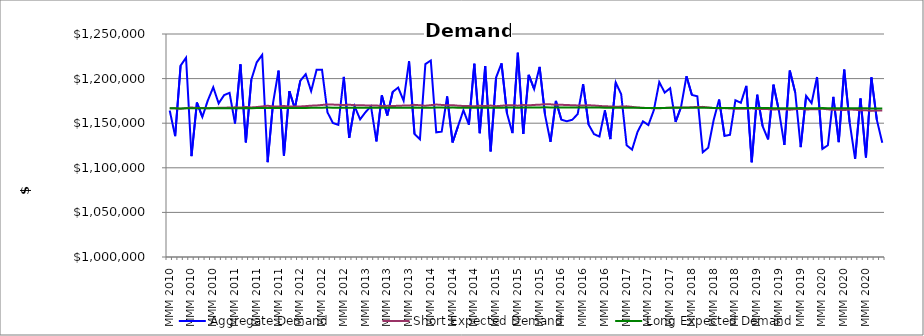
| Category | Aggregate Demand | Short Expected Demand | Long Expected Demand |
|---|---|---|---|
| MMM 2010 | 1164194.609 | 1166666.667 | 1166666.667 |
| MMM 2010 | 1135446.63 | 1166632.333 | 1166660.944 |
| MMM 2010 | 1214554.792 | 1166199.198 | 1166588.689 |
| MMM 2010 | 1223487.7 | 1166870.803 | 1166699.722 |
| MMM 2010 | 1113027.464 | 1167657.149 | 1166831.175 |
| MMM 2010 | 1173169.314 | 1166898.403 | 1166706.63 |
| MMM 2010 | 1157034.892 | 1166985.499 | 1166721.59 |
| MMM 2010 | 1175444.263 | 1166847.297 | 1166699.167 |
| MMM 2010 | 1190233.897 | 1166966.699 | 1166719.41 |
| MMM 2010 | 1172214.79 | 1167289.854 | 1166773.842 |
| MMM 2010 | 1181515.811 | 1167358.256 | 1166786.436 |
| MMM 2010 | 1184015.983 | 1167554.889 | 1166820.532 |
| MMM 2011 | 1149696.797 | 1167783.515 | 1166860.336 |
| MMM 2011 | 1215984.754 | 1167532.311 | 1166820.606 |
| MMM 2011 | 1128503.597 | 1168205.261 | 1166934.412 |
| MMM 2011 | 1198880.14 | 1167653.849 | 1166845.452 |
| MMM 2011 | 1218255.849 | 1168087.548 | 1166919.606 |
| MMM 2011 | 1226548.237 | 1168784.33 | 1167038.44 |
| MMM 2011 | 1106292.168 | 1169586.606 | 1167176.194 |
| MMM 2011 | 1172752.238 | 1168707.517 | 1167035.259 |
| MMM 2011 | 1208910.718 | 1168763.694 | 1167048.493 |
| MMM 2011 | 1113692.409 | 1169321.291 | 1167145.396 |
| MMM 2011 | 1185913.686 | 1168548.668 | 1167021.662 |
| MMM 2011 | 1166619.405 | 1168789.849 | 1167065.394 |
| MMM 2012 | 1197530.766 | 1168759.704 | 1167064.361 |
| MMM 2012 | 1204944.936 | 1169159.302 | 1167134.885 |
| MMM 2012 | 1185958.102 | 1169656.324 | 1167222.409 |
| MMM 2012 | 1209828.676 | 1169882.738 | 1167265.778 |
| MMM 2012 | 1209876.225 | 1170437.543 | 1167364.304 |
| MMM 2012 | 1162174.485 | 1170985.302 | 1167462.711 |
| MMM 2012 | 1150232.175 | 1170862.93 | 1167450.47 |
| MMM 2012 | 1148167.163 | 1170576.391 | 1167410.612 |
| MMM 2012 | 1201850.005 | 1170265.152 | 1167366.067 |
| MMM 2012 | 1133459.538 | 1170703.831 | 1167445.891 |
| MMM 2012 | 1168894.621 | 1170186.549 | 1167367.219 |
| MMM 2012 | 1154326.3 | 1170168.605 | 1167370.755 |
| MMM 2013 | 1162403.599 | 1169948.573 | 1167340.559 |
| MMM 2013 | 1168925.276 | 1169843.782 | 1167329.131 |
| MMM 2013 | 1129578.788 | 1169831.025 | 1167332.826 |
| MMM 2013 | 1181213.447 | 1169271.966 | 1167245.432 |
| MMM 2013 | 1158613.517 | 1169437.82 | 1167277.766 |
| MMM 2013 | 1185109.805 | 1169287.483 | 1167257.71 |
| MMM 2013 | 1189923.099 | 1169507.237 | 1167299.034 |
| MMM 2013 | 1175242.226 | 1169790.791 | 1167351.404 |
| MMM 2013 | 1219461.653 | 1169866.505 | 1167369.67 |
| MMM 2013 | 1137936.966 | 1170555.327 | 1167490.253 |
| MMM 2013 | 1132058.161 | 1170102.294 | 1167421.843 |
| MMM 2013 | 1216194.025 | 1169573.903 | 1167339.983 |
| MMM 2014 | 1220249.879 | 1170221.405 | 1167453.071 |
| MMM 2014 | 1139788.092 | 1170916.245 | 1167575.286 |
| MMM 2014 | 1140476.061 | 1170483.909 | 1167510.963 |
| MMM 2014 | 1179952.491 | 1170067.134 | 1167448.383 |
| MMM 2014 | 1128409.199 | 1170204.43 | 1167477.327 |
| MMM 2014 | 1146570.339 | 1169623.941 | 1167386.892 |
| MMM 2014 | 1164436.876 | 1169303.752 | 1167338.705 |
| MMM 2014 | 1148371.452 | 1169236.156 | 1167331.988 |
| MMM 2014 | 1216640.89 | 1168946.369 | 1167288.098 |
| MMM 2014 | 1138784.863 | 1169608.793 | 1167402.341 |
| MMM 2014 | 1213930.409 | 1169180.683 | 1167336.096 |
| MMM 2014 | 1118354.541 | 1169802.207 | 1167443.954 |
| MMM 2015 | 1201173.598 | 1169087.656 | 1167330.321 |
| MMM 2015 | 1217142.086 | 1169533.294 | 1167408.662 |
| MMM 2015 | 1161090.773 | 1170194.527 | 1167523.785 |
| MMM 2015 | 1138913.466 | 1170068.086 | 1167508.894 |
| MMM 2015 | 1228997.928 | 1169635.383 | 1167442.701 |
| MMM 2015 | 1137977.612 | 1170459.863 | 1167585.19 |
| MMM 2015 | 1204271.506 | 1170008.72 | 1167516.654 |
| MMM 2015 | 1188234.105 | 1170484.592 | 1167601.735 |
| MMM 2015 | 1213148.753 | 1170731.113 | 1167649.495 |
| MMM 2015 | 1159269.081 | 1171320.247 | 1167754.817 |
| MMM 2015 | 1129139.702 | 1171152.87 | 1167735.174 |
| MMM 2015 | 1174924.807 | 1170569.354 | 1167645.833 |
| MMM 2016 | 1153954.638 | 1170629.846 | 1167662.682 |
| MMM 2016 | 1152171.347 | 1170398.246 | 1167630.951 |
| MMM 2016 | 1153829.529 | 1170145.095 | 1167595.165 |
| MMM 2016 | 1160212.496 | 1169918.49 | 1167563.3 |
| MMM 2016 | 1193748.873 | 1169783.684 | 1167546.284 |
| MMM 2016 | 1148556.674 | 1170116.534 | 1167606.938 |
| MMM 2016 | 1137782.733 | 1169817.091 | 1167562.84 |
| MMM 2016 | 1135047.054 | 1169372.17 | 1167493.905 |
| MMM 2016 | 1164395.939 | 1168895.432 | 1167418.796 |
| MMM 2016 | 1132184.771 | 1168832.939 | 1167411.799 |
| MMM 2016 | 1195611.463 | 1168323.937 | 1167330.255 |
| MMM 2016 | 1182476.928 | 1168702.93 | 1167395.721 |
| MMM 2017 | 1125260.438 | 1168894.236 | 1167430.631 |
| MMM 2017 | 1120379.633 | 1168288.211 | 1167333.015 |
| MMM 2017 | 1140158.12 | 1167622.814 | 1167224.326 |
| MMM 2017 | 1152074.6 | 1167241.36 | 1167161.673 |
| MMM 2017 | 1147938.113 | 1167030.71 | 1167126.749 |
| MMM 2017 | 1164542.069 | 1166765.535 | 1167082.331 |
| MMM 2017 | 1196092.418 | 1166734.654 | 1167076.451 |
| MMM 2017 | 1184309.434 | 1167142.401 | 1167143.617 |
| MMM 2017 | 1189214.944 | 1167380.832 | 1167183.353 |
| MMM 2017 | 1151410.503 | 1167684.083 | 1167234.352 |
| MMM 2017 | 1168061.617 | 1167458.061 | 1167197.723 |
| MMM 2017 | 1202614.128 | 1167466.444 | 1167199.723 |
| MMM 2018 | 1181695.673 | 1167954.606 | 1167281.7 |
| MMM 2018 | 1180136.162 | 1168145.454 | 1167315.066 |
| MMM 2018 | 1117381.72 | 1168311.992 | 1167344.745 |
| MMM 2018 | 1122428.975 | 1167604.627 | 1167229.089 |
| MMM 2018 | 1153570.331 | 1166977.187 | 1167125.385 |
| MMM 2018 | 1176439.303 | 1166790.981 | 1167094.008 |
| MMM 2018 | 1135677.519 | 1166924.986 | 1167115.641 |
| MMM 2018 | 1136995.977 | 1166490.993 | 1167042.867 |
| MMM 2018 | 1175700.466 | 1166081.34 | 1166973.314 |
| MMM 2018 | 1172873.951 | 1166214.939 | 1166993.516 |
| MMM 2018 | 1191805.153 | 1166307.425 | 1167007.128 |
| MMM 2018 | 1106207.563 | 1166661.56 | 1167064.531 |
| MMM 2019 | 1181861.575 | 1165821.922 | 1166923.658 |
| MMM 2019 | 1146714.953 | 1166044.695 | 1166958.237 |
| MMM 2019 | 1131796.245 | 1165776.226 | 1166911.377 |
| MMM 2019 | 1193152.342 | 1165304.282 | 1166830.092 |
| MMM 2019 | 1163774.311 | 1165691.06 | 1166891.024 |
| MMM 2019 | 1125610.974 | 1165664.439 | 1166883.809 |
| MMM 2019 | 1208971.79 | 1165108.141 | 1166788.27 |
| MMM 2019 | 1184351.964 | 1165717.358 | 1166885.917 |
| MMM 2019 | 1123131.837 | 1165976.172 | 1166926.348 |
| MMM 2019 | 1180714.486 | 1165381.112 | 1166824.971 |
| MMM 2019 | 1172435.462 | 1165594.075 | 1166857.123 |
| MMM 2019 | 1201792.541 | 1165689.095 | 1166870.036 |
| MMM 2020 | 1121212.226 | 1166190.531 | 1166950.875 |
| MMM 2020 | 1125304.265 | 1165565.833 | 1166844.999 |
| MMM 2020 | 1179486.173 | 1165006.644 | 1166748.839 |
| MMM 2020 | 1128815.107 | 1165207.749 | 1166778.324 |
| MMM 2020 | 1210018.111 | 1164702.295 | 1166690.446 |
| MMM 2020 | 1150922.285 | 1165331.682 | 1166790.742 |
| MMM 2020 | 1110017.127 | 1165131.551 | 1166754.009 |
| MMM 2020 | 1177706.949 | 1164366.073 | 1166622.674 |
| MMM 2020 | 1111599.781 | 1164551.363 | 1166648.332 |
| MMM 2020 | 1201240.417 | 1163815.924 | 1166520.905 |
| MMM 2020 | 1153677.843 | 1164335.709 | 1166601.274 |
| MMM 2020 | 1128012.75 | 1164187.683 | 1166571.359 |